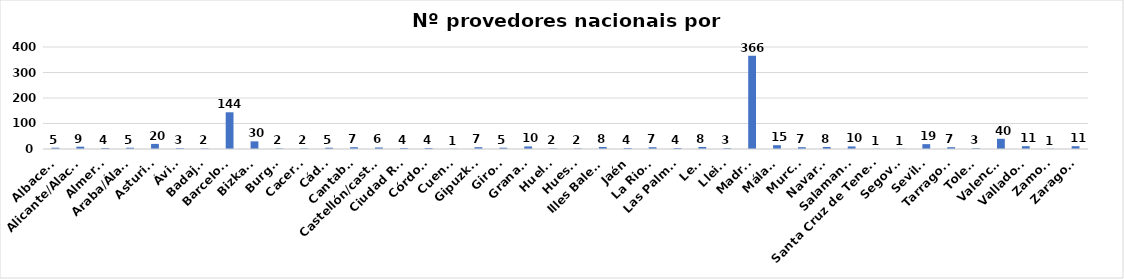
| Category | Series 0 |
|---|---|
| Albacete | 5 |
| Alicante/Alacant | 9 |
| Almería | 4 |
| Araba/Álava | 5 |
| Asturias | 20 |
| Ávila | 3 |
| Badajoz | 2 |
| Barcelona | 144 |
| Bizkaia | 30 |
| Burgos | 2 |
| Caceres | 2 |
| Cádiz | 5 |
| Cantabria | 7 |
| Castellón/castelló | 6 |
| Ciudad Real | 4 |
| Córdoba | 4 |
| Cuenca | 1 |
| Gipuzkoa | 7 |
| Girona | 5 |
| Granada | 10 |
| Huelva | 2 |
| Huesca | 2 |
| Illes Balears | 8 |
| Jaén | 4 |
| La Rioja | 7 |
| Las Palmas | 4 |
| León | 8 |
| Lleida | 3 |
| Madrid | 366 |
| Málaga | 15 |
| Murcia | 7 |
| Navarra | 8 |
| Salamanca | 10 |
| Santa Cruz de Tenerife | 1 |
| Segovia | 1 |
| Sevilla | 19 |
| Tarragona | 7 |
| Toledo | 3 |
| Valencia | 40 |
| Valladolid | 11 |
| Zamora | 1 |
| Zaragoza | 11 |